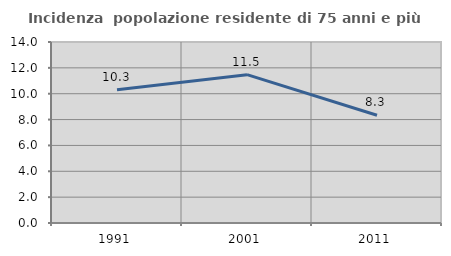
| Category | Incidenza  popolazione residente di 75 anni e più |
|---|---|
| 1991.0 | 10.3 |
| 2001.0 | 11.475 |
| 2011.0 | 8.333 |